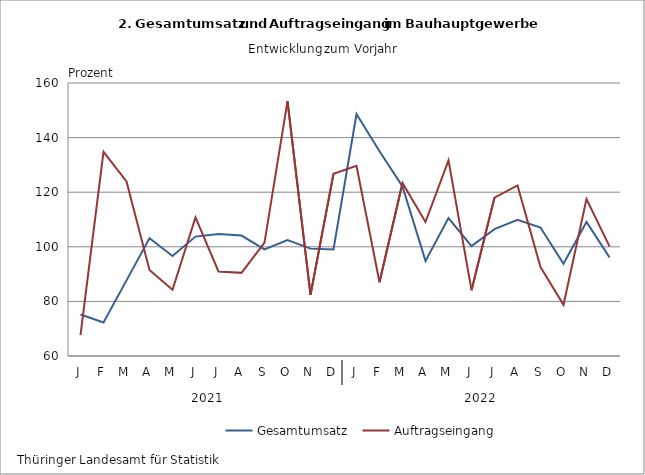
| Category | Gesamtumsatz | Auftragseingang |
|---|---|---|
| J | 75.225 | 67.682 |
| F | 72.306 | 134.798 |
| M | 87.703 | 123.955 |
| A | 103.164 | 91.521 |
| M | 96.603 | 84.237 |
| J | 103.739 | 110.796 |
| J | 104.686 | 90.977 |
| A | 104.131 | 90.459 |
| S | 99.046 | 101.504 |
| O | 102.501 | 153.34 |
| N | 99.331 | 82.429 |
| D | 99.019 | 126.721 |
| J | 148.64 | 129.685 |
| F | 134.99 | 87.034 |
| M | 122.111 | 123.373 |
| A | 94.844 | 109.065 |
| M | 110.531 | 131.683 |
| J | 100.239 | 84.113 |
| J | 106.481 | 118.039 |
| A | 109.845 | 122.495 |
| S | 107.05 | 92.564 |
| O | 93.763 | 78.772 |
| N | 109.115 | 117.453 |
| D | 96.114 | 100.165 |